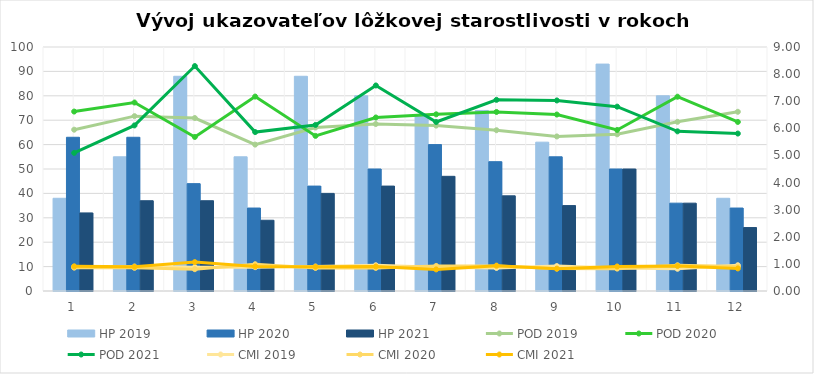
| Category | HP 2019 | HP 2020 | HP 2021 |
|---|---|---|---|
| 0 | 38 | 63 | 32 |
| 1 | 55 | 63 | 37 |
| 2 | 88 | 44 | 37 |
| 3 | 55 | 34 | 29 |
| 4 | 88 | 43 | 40 |
| 5 | 80 | 50 | 43 |
| 6 | 72 | 60 | 47 |
| 7 | 74 | 53 | 39 |
| 8 | 61 | 55 | 35 |
| 9 | 93 | 50 | 50 |
| 10 | 80 | 36 | 36 |
| 11 | 38 | 34 | 26 |